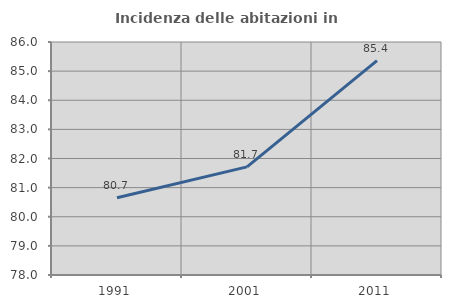
| Category | Incidenza delle abitazioni in proprietà  |
|---|---|
| 1991.0 | 80.655 |
| 2001.0 | 81.713 |
| 2011.0 | 85.36 |